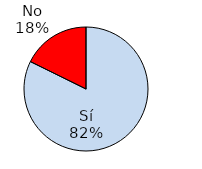
| Category | Series 1 |
|---|---|
| Sí | 144 |
| No | 31 |